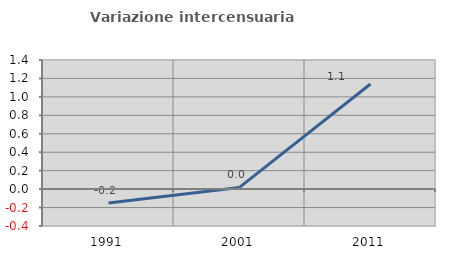
| Category | Variazione intercensuaria annua |
|---|---|
| 1991.0 | -0.151 |
| 2001.0 | 0.018 |
| 2011.0 | 1.14 |